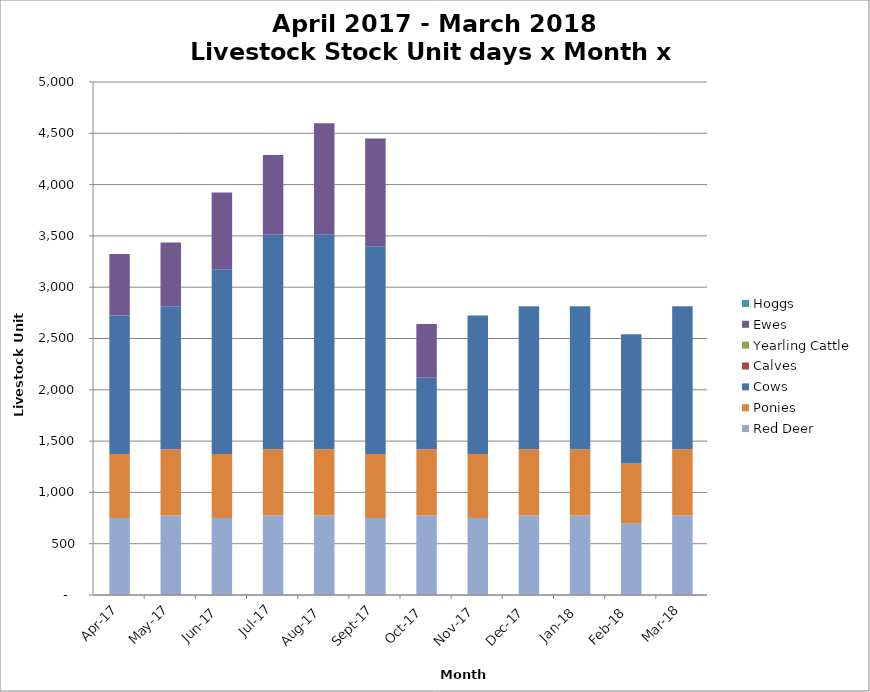
| Category | Red Deer | Ponies | Cows | Calves | Yearling Cattle | Ewes | Hoggs |
|---|---|---|---|---|---|---|---|
| 2017-04-01 | 750 | 624 | 1350 | 0 | 0 | 600 | 0 |
| 2017-05-01 | 775 | 644.8 | 1395 | 0 | 0 | 620 | 0 |
| 2017-06-01 | 750 | 624 | 1800 | 0 | 0 | 750 | 0 |
| 2017-07-01 | 775 | 644.8 | 2092.5 | 0 | 0 | 775 | 0 |
| 2017-08-01 | 775 | 644.8 | 2092.5 | 0 | 0 | 1085 | 0 |
| 2017-09-01 | 750 | 624 | 2025 | 0 | 0 | 1050 | 0 |
| 2017-10-01 | 775 | 644.8 | 697.5 | 0 | 0 | 525 | 0 |
| 2017-11-01 | 750 | 624 | 1350 | 0 | 0 | 0 | 0 |
| 2017-12-01 | 775 | 644.8 | 1395 | 0 | 0 | 0 | 0 |
| 2018-01-01 | 775 | 644.8 | 1395 | 0 | 0 | 0 | 0 |
| 2018-02-01 | 700 | 582.4 | 1260 | 0 | 0 | 0 | 0 |
| 2018-03-01 | 775 | 644.8 | 1395 | 0 | 0 | 0 | 0 |